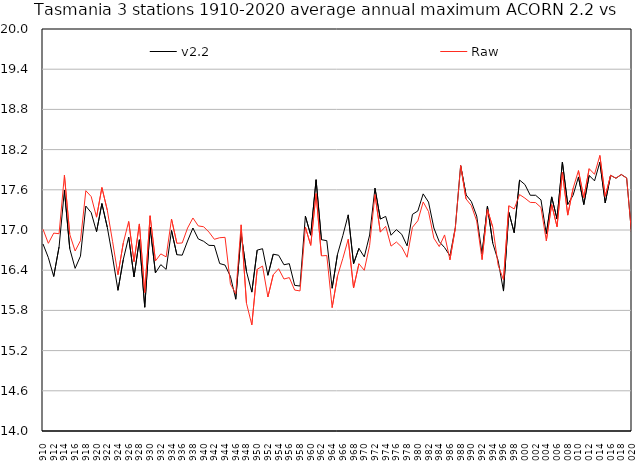
| Category | v2.2 | Raw |
|---|---|---|
| 1910 | 16.792 | 17.011 |
| 1911 | 16.588 | 16.801 |
| 1912 | 16.306 | 16.953 |
| 1913 | 16.748 | 16.945 |
| 1914 | 17.593 | 17.818 |
| 1915 | 16.72 | 16.934 |
| 1916 | 16.428 | 16.687 |
| 1917 | 16.61 | 16.841 |
| 1918 | 17.357 | 17.587 |
| 1919 | 17.26 | 17.499 |
| 1920 | 16.975 | 17.191 |
| 1921 | 17.395 | 17.634 |
| 1922 | 17.043 | 17.298 |
| 1923 | 16.595 | 16.826 |
| 1924 | 16.1 | 16.333 |
| 1925 | 16.561 | 16.809 |
| 1926 | 16.895 | 17.127 |
| 1927 | 16.3 | 16.528 |
| 1928 | 16.854 | 17.091 |
| 1929 | 15.847 | 16.067 |
| 1930 | 17.044 | 17.213 |
| 1931 | 16.359 | 16.538 |
| 1932 | 16.483 | 16.644 |
| 1933 | 16.412 | 16.599 |
| 1934 | 16.992 | 17.163 |
| 1935 | 16.631 | 16.802 |
| 1936 | 16.624 | 16.806 |
| 1937 | 16.835 | 17.029 |
| 1938 | 17.03 | 17.179 |
| 1939 | 16.867 | 17.061 |
| 1940 | 16.831 | 17.049 |
| 1941 | 16.771 | 16.968 |
| 1942 | 16.768 | 16.861 |
| 1943 | 16.499 | 16.885 |
| 1944 | 16.476 | 16.89 |
| 1945 | 16.307 | 16.196 |
| 1946 | 15.967 | 16.046 |
| 1947 | 16.948 | 17.077 |
| 1948 | 16.381 | 15.907 |
| 1949 | 16.073 | 15.584 |
| 1950 | 16.7 | 16.413 |
| 1951 | 16.721 | 16.462 |
| 1952 | 16.324 | 16 |
| 1953 | 16.639 | 16.332 |
| 1954 | 16.623 | 16.422 |
| 1955 | 16.481 | 16.268 |
| 1956 | 16.498 | 16.29 |
| 1957 | 16.174 | 16.104 |
| 1958 | 16.164 | 16.091 |
| 1959 | 17.208 | 17.042 |
| 1960 | 16.923 | 16.771 |
| 1961 | 17.751 | 17.543 |
| 1962 | 16.856 | 16.614 |
| 1963 | 16.841 | 16.619 |
| 1964 | 16.13 | 15.842 |
| 1965 | 16.638 | 16.312 |
| 1966 | 16.918 | 16.577 |
| 1967 | 17.226 | 16.861 |
| 1968 | 16.497 | 16.135 |
| 1969 | 16.726 | 16.497 |
| 1970 | 16.599 | 16.399 |
| 1971 | 16.925 | 16.772 |
| 1972 | 17.625 | 17.528 |
| 1973 | 17.163 | 16.968 |
| 1974 | 17.203 | 17.055 |
| 1975 | 16.922 | 16.759 |
| 1976 | 17.005 | 16.821 |
| 1977 | 16.936 | 16.744 |
| 1978 | 16.763 | 16.593 |
| 1979 | 17.234 | 17.041 |
| 1980 | 17.284 | 17.137 |
| 1981 | 17.539 | 17.419 |
| 1982 | 17.417 | 17.275 |
| 1983 | 17.03 | 16.878 |
| 1984 | 16.826 | 16.753 |
| 1985 | 16.738 | 16.926 |
| 1986 | 16.615 | 16.554 |
| 1987 | 17.034 | 17.026 |
| 1988 | 17.961 | 17.963 |
| 1989 | 17.526 | 17.464 |
| 1990 | 17.424 | 17.364 |
| 1991 | 17.208 | 17.133 |
| 1992 | 16.643 | 16.558 |
| 1993 | 17.356 | 17.306 |
| 1994 | 16.802 | 17.041 |
| 1995 | 16.543 | 16.476 |
| 1996 | 16.089 | 16.257 |
| 1997 | 17.263 | 17.362 |
| 1998 | 16.959 | 17.314 |
| 1999 | 17.746 | 17.529 |
| 2000 | 17.678 | 17.475 |
| 2001 | 17.519 | 17.412 |
| 2002 | 17.518 | 17.409 |
| 2003 | 17.45 | 17.336 |
| 2004 | 16.941 | 16.839 |
| 2005 | 17.494 | 17.381 |
| 2006 | 17.164 | 17.048 |
| 2007 | 18.014 | 17.863 |
| 2008 | 17.381 | 17.222 |
| 2009 | 17.519 | 17.621 |
| 2010 | 17.792 | 17.887 |
| 2011 | 17.38 | 17.482 |
| 2012 | 17.814 | 17.915 |
| 2013 | 17.733 | 17.831 |
| 2014 | 18.013 | 18.113 |
| 2015 | 17.404 | 17.502 |
| 2016 | 17.816 | 17.817 |
| 2017 | 17.772 | 17.773 |
| 2018 | 17.827 | 17.829 |
| 2019 | 17.777 | 17.774 |
| 2020 | 16.876 | 16.876 |